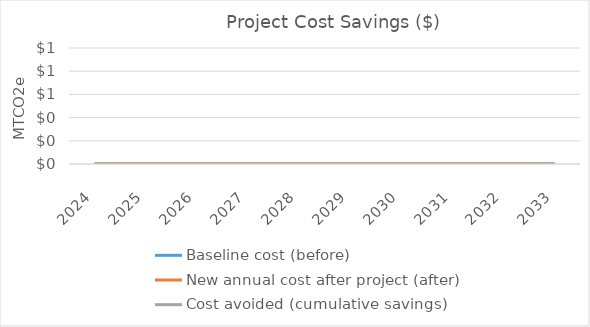
| Category | Baseline cost (before) | New annual cost after project (after) | Cost avoided (cumulative savings) |
|---|---|---|---|
| 2024.0 | 0 | 0 | 0 |
| 2025.0 | 0 | 0 | 0 |
| 2026.0 | 0 | 0 | 0 |
| 2027.0 | 0 | 0 | 0 |
| 2028.0 | 0 | 0 | 0 |
| 2029.0 | 0 | 0 | 0 |
| 2030.0 | 0 | 0 | 0 |
| 2031.0 | 0 | 0 | 0 |
| 2032.0 | 0 | 0 | 0 |
| 2033.0 | 0 | 0 | 0 |